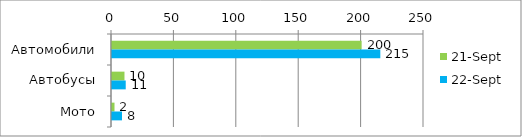
| Category | 21.сен | 22.сен |
|---|---|---|
| Автомобили | 200 | 215 |
| Автобусы | 10 | 11 |
| Мото | 2 | 8 |